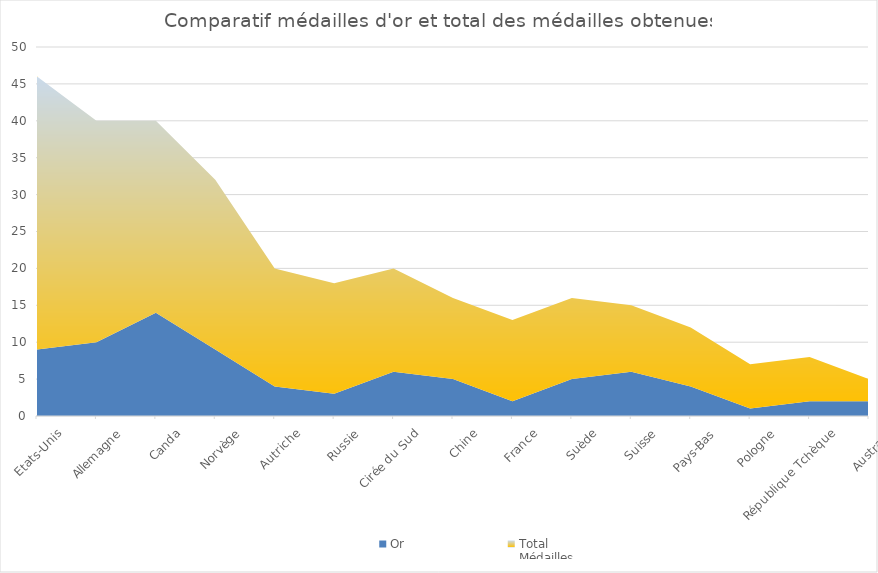
| Category | Or | Total
Médailles |
|---|---|---|
| Etats-Unis | 9 | 37 |
| Allemagne | 10 | 30 |
| Canda | 14 | 26 |
| Norvège | 9 | 23 |
| Autriche | 4 | 16 |
| Russie | 3 | 15 |
| Cirée du Sud | 6 | 14 |
| Chine | 5 | 11 |
| France | 2 | 11 |
| Suède | 5 | 11 |
| Suisse | 6 | 9 |
| Pays-Bas | 4 | 8 |
| Pologne | 1 | 6 |
| République Tchèque | 2 | 6 |
| Australie | 2 | 3 |